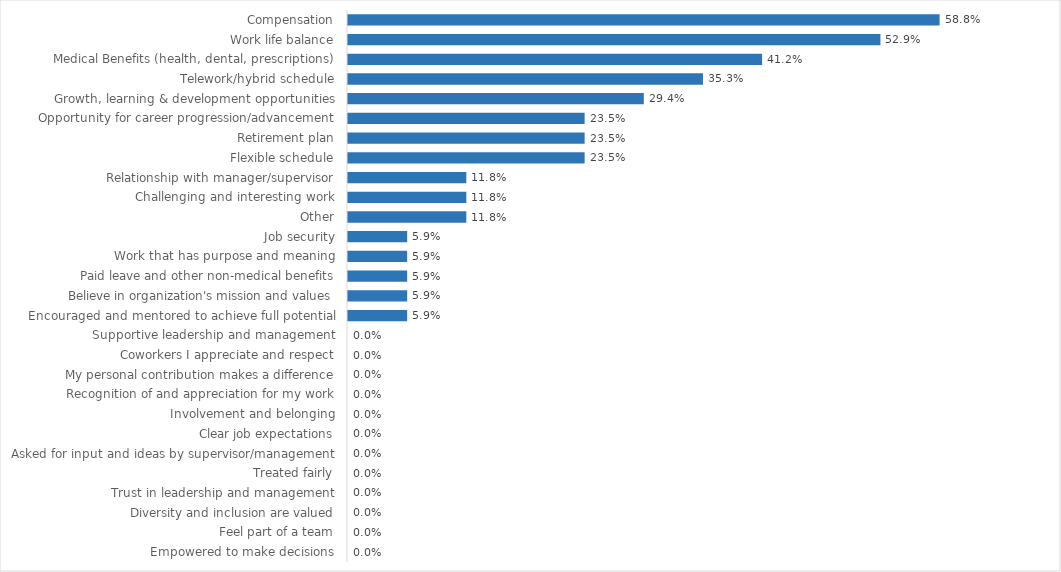
| Category | State Treasurer |
|---|---|
| Compensation | 0.588 |
| Work life balance | 0.529 |
| Medical Benefits (health, dental, prescriptions) | 0.412 |
| Telework/hybrid schedule | 0.353 |
| Growth, learning & development opportunities | 0.294 |
| Opportunity for career progression/advancement | 0.235 |
| Retirement plan | 0.235 |
| Flexible schedule | 0.235 |
| Relationship with manager/supervisor | 0.118 |
| Challenging and interesting work | 0.118 |
| Other | 0.118 |
| Job security | 0.059 |
| Work that has purpose and meaning | 0.059 |
| Paid leave and other non-medical benefits | 0.059 |
| Believe in organization's mission and values | 0.059 |
| Encouraged and mentored to achieve full potential | 0.059 |
| Supportive leadership and management | 0 |
| Coworkers I appreciate and respect | 0 |
| My personal contribution makes a difference | 0 |
| Recognition of and appreciation for my work | 0 |
| Involvement and belonging | 0 |
| Clear job expectations | 0 |
| Asked for input and ideas by supervisor/management | 0 |
| Treated fairly | 0 |
| Trust in leadership and management | 0 |
| Diversity and inclusion are valued | 0 |
| Feel part of a team | 0 |
| Empowered to make decisions | 0 |